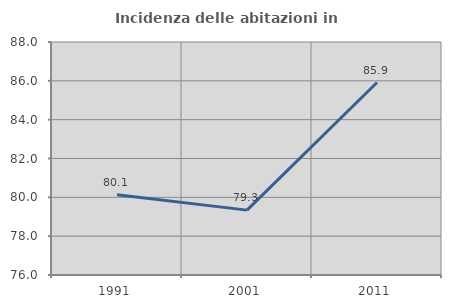
| Category | Incidenza delle abitazioni in proprietà  |
|---|---|
| 1991.0 | 80.132 |
| 2001.0 | 79.341 |
| 2011.0 | 85.912 |